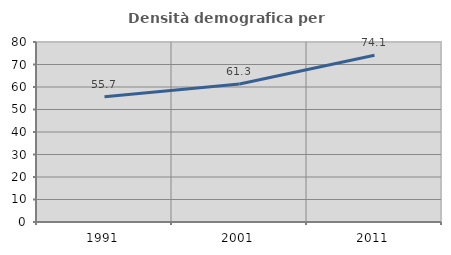
| Category | Densità demografica |
|---|---|
| 1991.0 | 55.659 |
| 2001.0 | 61.299 |
| 2011.0 | 74.137 |